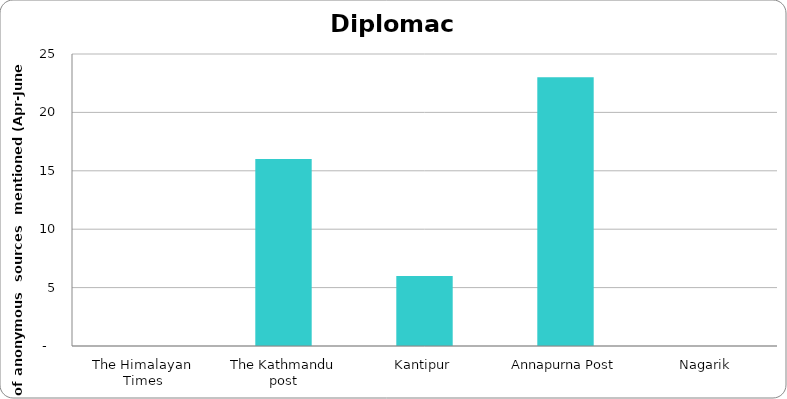
| Category | Diplomacy |
|---|---|
| The Himalayan Times | 0 |
| The Kathmandu post | 16 |
| Kantipur | 6 |
| Annapurna Post | 23 |
| Nagarik | 0 |